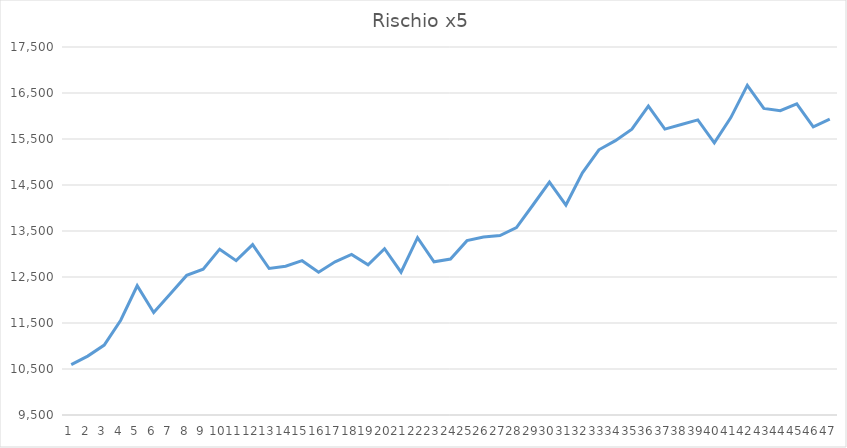
| Category | Series 0 |
|---|---|
| 0 | 10595 |
| 1 | 10780 |
| 2 | 11020 |
| 3 | 11560 |
| 4 | 12310 |
| 5 | 11730 |
| 6 | 12130 |
| 7 | 12535 |
| 8 | 12670 |
| 9 | 13105 |
| 10 | 12855 |
| 11 | 13205 |
| 12 | 12685 |
| 13 | 12735 |
| 14 | 12855 |
| 15 | 12605 |
| 16 | 12830 |
| 17 | 12990 |
| 18 | 12765 |
| 19 | 13115 |
| 20 | 12605 |
| 21 | 13355 |
| 22 | 12830 |
| 23 | 12890 |
| 24 | 13290 |
| 25 | 13370 |
| 26 | 13400 |
| 27 | 13575 |
| 28 | 14065 |
| 29 | 14565 |
| 30 | 14065 |
| 31 | 14765 |
| 32 | 15265 |
| 33 | 15465 |
| 34 | 15715 |
| 35 | 16215 |
| 36 | 15715 |
| 37 | 15815 |
| 38 | 15915 |
| 39 | 15415 |
| 40 | 15965 |
| 41 | 16665 |
| 42 | 16165 |
| 43 | 16115 |
| 44 | 16265 |
| 45 | 15765 |
| 46 | 15930 |